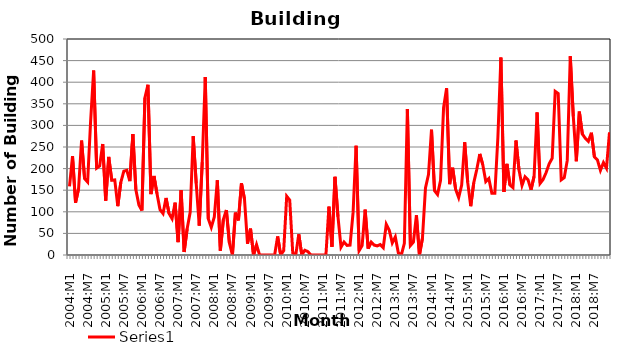
| Category | Series 0 |
|---|---|
| 2004:M1 | 159 |
| 2004:M2 | 229 |
| 2004:M3 | 121 |
| 2004:M4 | 153 |
| 2004:M5 | 265 |
| 2004:M6 | 177 |
| 2004:M7 | 169 |
| 2004:M8 | 310 |
| 2004:M9 | 427 |
| 2004:M10 | 201 |
| 2004:M11 | 206 |
| 2004:M12 | 257 |
| 2005:M1 | 126 |
| 2005:M2 | 227 |
| 2005:M3 | 173 |
| 2005:M4 | 174 |
| 2005:M5 | 113 |
| 2005:M6 | 168 |
| 2005:M7 | 194 |
| 2005:M8 | 196 |
| 2005:M9 | 171 |
| 2005:M10 | 280 |
| 2005:M11 | 151 |
| 2005:M12 | 116 |
| 2006:M1 | 103 |
| 2006:M2 | 364 |
| 2006:M3 | 394 |
| 2006:M4 | 141 |
| 2006:M5 | 183 |
| 2006:M6 | 142 |
| 2006:M7 | 105 |
| 2006:M8 | 96 |
| 2006:M9 | 132 |
| 2006:M10 | 96 |
| 2006:M11 | 84 |
| 2006:M12 | 121 |
| 2007:M1 | 30 |
| 2007:M2 | 150 |
| 2007:M3 | 7 |
| 2007:M4 | 61 |
| 2007:M5 | 99 |
| 2007:M6 | 275 |
| 2007:M7 | 166 |
| 2007:M8 | 68 |
| 2007:M9 | 215 |
| 2007:M10 | 412 |
| 2007:M11 | 84 |
| 2007:M12 | 64 |
| 2008:M1 | 88 |
| 2008:M2 | 173 |
| 2008:M3 | 10 |
| 2008:M4 | 82 |
| 2008:M5 | 104 |
| 2008:M6 | 28 |
| 2008:M7 | 0 |
| 2008:M8 | 98 |
| 2008:M9 | 80 |
| 2008:M10 | 166 |
| 2008:M11 | 130 |
| 2008:M12 | 26 |
| 2009:M1 | 61 |
| 2009:M2 | 0 |
| 2009:M3 | 24 |
| 2009:M4 | 0 |
| 2009:M5 | 0 |
| 2009:M6 | 0 |
| 2009:M7 | 0 |
| 2009:M8 | 0 |
| 2009:M9 | 0 |
| 2009:M10 | 43 |
| 2009:M11 | 0 |
| 2009:M12 | 10 |
| 2010:M1 | 136 |
| 2010:M2 | 127 |
| 2010:M3 | 5 |
| 2010:M4 | 0 |
| 2010:M5 | 48 |
| 2010:M6 | 0 |
| 2010:M7 | 11 |
| 2010:M8 | 8 |
| 2010:M9 | 0 |
| 2010:M10 | 0 |
| 2010:M11 | 0 |
| 2010:M12 | 0 |
| 2011:M1 | 0 |
| 2011:M2 | 0 |
| 2011:M3 | 112 |
| 2011:M4 | 19 |
| 2011:M5 | 181 |
| 2011:M6 | 88 |
| 2011:M7 | 18 |
| 2011:M8 | 30 |
| 2011:M9 | 22 |
| 2011:M10 | 23 |
| 2011:M11 | 98 |
| 2011:M12 | 253 |
| 2012:M1 | 10 |
| 2012:M2 | 22 |
| 2012:M3 | 105 |
| 2012:M4 | 15 |
| 2012:M5 | 30 |
| 2012:M6 | 23 |
| 2012:M7 | 21 |
| 2012:M8 | 24 |
| 2012:M9 | 17 |
| 2012:M10 | 71 |
| 2012:M11 | 57 |
| 2012:M12 | 28 |
| 2013:M1 | 42 |
| 2013:M2 | 5 |
| 2013:M3 | 0 |
| 2013:M4 | 27 |
| 2013:M5 | 338 |
| 2013:M6 | 22 |
| 2013:M7 | 30 |
| 2013:M8 | 92 |
| 2013:M9 | 0 |
| 2013:M10 | 39 |
| 2013:M11 | 155 |
| 2013:M12 | 186 |
| 2014:M1 | 290 |
| 2014:M2 | 149 |
| 2014:M3 | 140 |
| 2014:M4 | 173 |
| 2014:M5 | 341 |
| 2014:M6 | 386 |
| 2014:M7 | 164 |
| 2014:M8 | 202 |
| 2014:M9 | 152 |
| 2014:M10 | 133 |
| 2014:M11 | 162 |
| 2014:M12 | 261 |
| 2015:M1 | 168 |
| 2015:M2 | 113 |
| 2015:M3 | 167 |
| 2015:M4 | 198 |
| 2015:M5 | 234 |
| 2015:M6 | 209 |
| 2015:M7 | 170 |
| 2015:M8 | 177 |
| 2015:M9 | 143 |
| 2015:M10 | 143 |
| 2015:M11 | 272 |
| 2015:M12 | 457 |
| 2016:M1 | 146 |
| 2016:M2 | 211 |
| 2016:M3 | 162 |
| 2016:M4 | 156 |
| 2016:M5 | 265 |
| 2016:M6 | 197 |
| 2016:M7 | 161 |
| 2016:M8 | 181 |
| 2016:M9 | 174 |
| 2016:M10 | 151 |
| 2016:M11 | 182 |
| 2016:M12 | 330 |
| 2017:M1 | 166 |
| 2017:M2 | 175 |
| 2017:M3 | 191 |
| 2017:M4 | 211 |
| 2017:M5 | 224 |
| 2017:M6 | 379 |
| 2017:M7 | 374 |
| 2017:M8 | 174 |
| 2017:M9 | 179 |
| 2017:M10 | 219 |
| 2017:M11 | 460 |
| 2017:M12 | 321 |
| 2018:M1 | 217 |
| 2018:M2 | 332 |
| 2018:M3 | 280 |
| 2018:M4 | 270 |
| 2018:M5 | 263 |
| 2018:M6 | 283 |
| 2018:M7 | 227 |
| 2018:M8 | 220 |
| 2018:M9 | 196 |
| 2018:M10 | 214 |
| 2018:M11 | 201 |
| 2018:M12 | 284 |